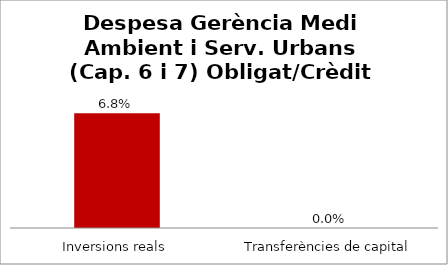
| Category | Series 0 |
|---|---|
| Inversions reals | 0.068 |
| Transferències de capital | 0 |